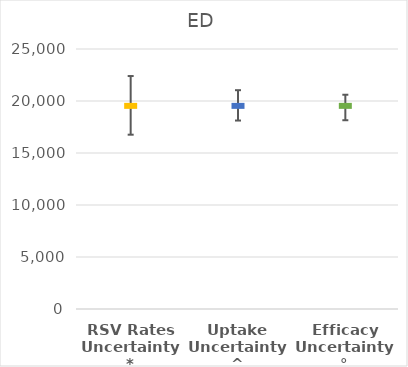
| Category | Series 0 |
|---|---|
| RSV Rates Uncertainty* | 19580 |
| Uptake Uncertainty^ | 19580 |
| Efficacy Uncertainty° | 19580 |